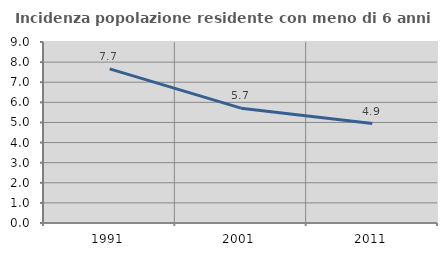
| Category | Incidenza popolazione residente con meno di 6 anni |
|---|---|
| 1991.0 | 7.663 |
| 2001.0 | 5.709 |
| 2011.0 | 4.942 |